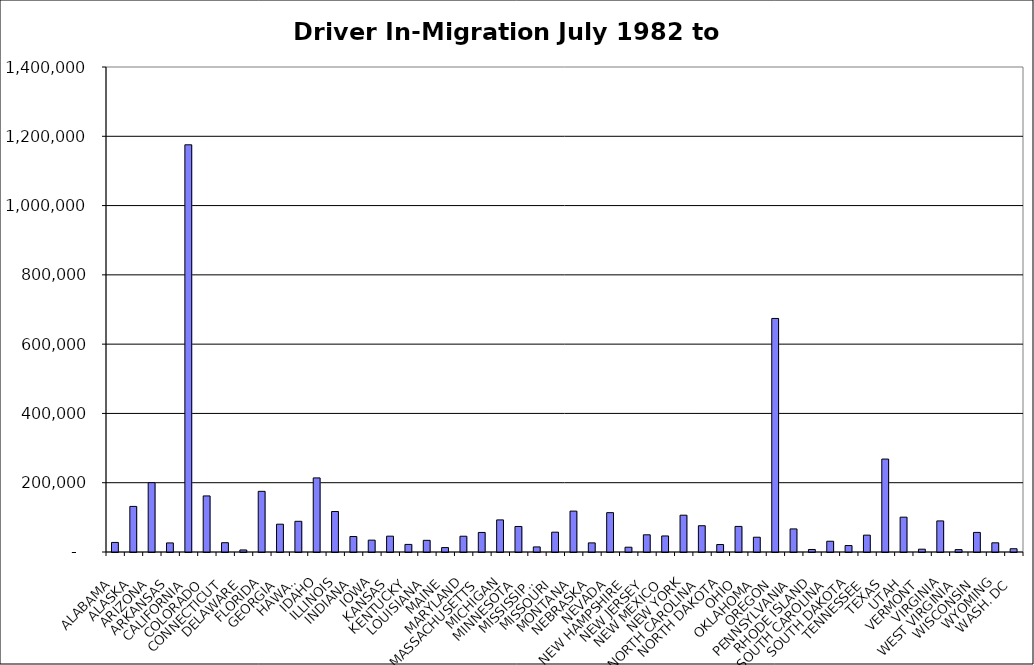
| Category | Series 0 |
|---|---|
| ALABAMA | 27627.5 |
| ALASKA | 131584.5 |
| ARIZONA | 200137 |
| ARKANSAS | 26228.5 |
| CALIFORNIA | 1175388.5 |
| COLORADO | 161840 |
| CONNECTICUT | 26837 |
| DELAWARE | 5910.5 |
| FLORIDA | 175093 |
| GEORGIA | 80243 |
| HAWAII | 88607.5 |
| IDAHO | 213875.5 |
| ILLINOIS | 116885.5 |
| INDIANA | 44657 |
| IOWA | 34235.5 |
| KANSAS | 45734.5 |
| KENTUCKY | 21899 |
| LOUISIANA | 33676.5 |
| MAINE | 12735.5 |
| MARYLAND | 45519 |
| MASSACHUSETTS | 56464 |
| MICHIGAN | 92644 |
| MINNESOTA | 73689.5 |
| MISSISSIPPI | 14690 |
| MISSOURI | 57205 |
| MONTANA | 118009 |
| NEBRASKA | 26298.5 |
| NEVADA | 113577 |
| NEW HAMPSHIRE | 13832.5 |
| NEW JERSEY | 49646 |
| NEW MEXICO | 46320 |
| NEW YORK | 106254 |
| NORTH CAROLINA | 75861.5 |
| NORTH DAKOTA | 21580.5 |
| OHIO | 73842.5 |
| OKLAHOMA | 42665 |
| OREGON | 674159 |
| PENNSYLVANIA | 66625.5 |
| RHODE ISLAND | 7274 |
| SOUTH CAROLINA | 31069.5 |
| SOUTH DAKOTA | 18624.5 |
| TENNESSEE | 48659.5 |
| TEXAS | 268268 |
| UTAH | 100542.5 |
| VERMONT | 8148 |
| VIRGINIA | 89715 |
| WEST VIRGINIA | 6875.5 |
| WISCONSIN | 56539.5 |
| WYOMING | 26538 |
| WASH. DC | 9438 |